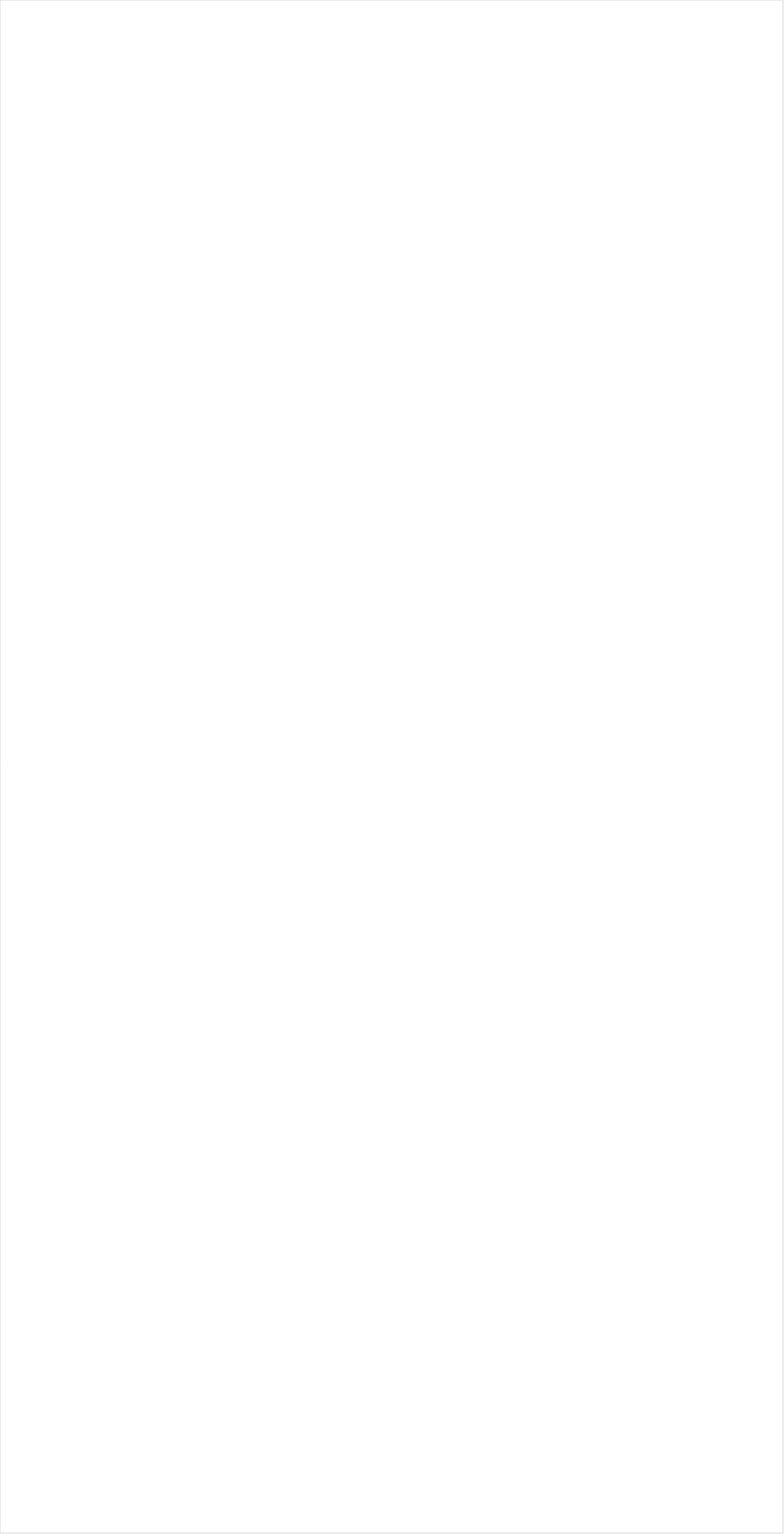
| Category | Total |
|---|---|
| Galavision | -0.924 |
| UniMas | -0.92 |
| ESPN Deportes | -0.895 |
| TUDN | -0.881 |
| BET Her | -0.853 |
| Telemundo | -0.841 |
| NBC Universo | -0.714 |
| BET | -0.691 |
| Univision | -0.675 |
| TV ONE | -0.609 |
| VH1 | -0.594 |
| Cartoon Network | -0.593 |
| NBA TV | -0.589 |
| Nick Toons | -0.533 |
| Teen Nick | -0.463 |
| Nick Jr. | -0.442 |
| Disney XD | -0.435 |
| Disney Channel | -0.425 |
| Adult Swim | -0.419 |
| Lifetime | -0.397 |
| Oprah Winfrey Network | -0.382 |
| Nick | -0.366 |
| Tennis Channel | -0.358 |
| Lifetime Movies | -0.353 |
| Disney Junior US | -0.32 |
| MTV2 | -0.317 |
| Nick@Nite | -0.302 |
| Universal Kids | -0.302 |
| BRAVO | -0.299 |
| MSNBC | -0.288 |
| CNN | -0.276 |
| E! | -0.215 |
| TLC | -0.203 |
| Discovery Life Channel | -0.118 |
| WE TV | -0.113 |
| Bloomberg HD | -0.099 |
| Logo | -0.097 |
| MTV | -0.081 |
| Discovery Family Channel | -0.057 |
| FXX | -0.041 |
| SYFY | -0.03 |
| OXYGEN | -0.016 |
| TBS | -0.01 |
| FX | 0.002 |
| MyNetworkTV | 0.005 |
| Freeform | 0.009 |
| HGTV | 0.01 |
| TNT | 0.012 |
| ESPN | 0.019 |
| PBS | 0.023 |
| ESPN2 | 0.036 |
| BBC America | 0.039 |
| Hallmark Movies & Mysteries | 0.046 |
| Investigation Discovery | 0.048 |
| Hallmark | 0.05 |
| truTV | 0.072 |
| POP | 0.073 |
| Comedy Central | 0.079 |
| ION | 0.084 |
| CW | 0.091 |
| Game Show | 0.114 |
| CNBC | 0.117 |
| ABC | 0.134 |
| Travel | 0.136 |
| UP TV | 0.141 |
| AMC | 0.162 |
| FX Movie Channel | 0.172 |
| Headline News | 0.181 |
| Paramount Network | 0.199 |
| USA Network | 0.204 |
| NFL Network | 0.207 |
| NBC | 0.207 |
| Ovation | 0.21 |
| Food Network | 0.22 |
| TV LAND | 0.226 |
| Olympic Channel | 0.242 |
| CMTV | 0.246 |
| Golf | 0.29 |
| Cooking Channel | 0.294 |
| Viceland | 0.308 |
| Big Ten Network | 0.321 |
| Independent Film (IFC) | 0.34 |
| CBS | 0.35 |
| SundanceTV | 0.356 |
| PAC-12 Network | 0.414 |
| FOX | 0.427 |
| NBC Sports | 0.446 |
| National Geographic Wild | 0.476 |
| Fox News | 0.48 |
| Fox Business | 0.504 |
| MLB Network | 0.507 |
| ESPNU | 0.509 |
| A&E | 0.513 |
| INSP | 0.552 |
| Great American Country | 0.562 |
| American Heroes Channel | 0.571 |
| Reelz Channel | 0.579 |
| ESPNEWS | 0.598 |
| DIY | 0.641 |
| WGN America | 0.646 |
| Animal Planet | 0.647 |
| National Geographic | 0.71 |
| Smithsonian | 0.726 |
| Destination America | 0.738 |
| NHL | 0.75 |
| Science Channel | 0.763 |
| History Channel | 0.811 |
| CBS Sports | 0.839 |
| FXDEP | 0.926 |
| Discovery Channel | 0.974 |
| FYI | 1.059 |
| The Sportsman Channel | 1.285 |
| Outdoor Channel | 1.324 |
| Weather Channel | 1.365 |
| RFD TV | 1.456 |
| Motor Trend Network | 1.686 |
| Fox Sports 1 | 2.548 |